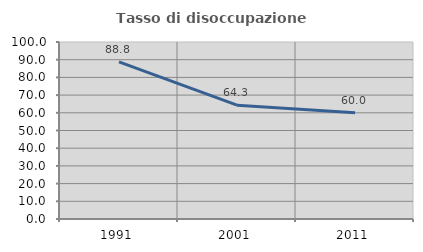
| Category | Tasso di disoccupazione giovanile  |
|---|---|
| 1991.0 | 88.785 |
| 2001.0 | 64.286 |
| 2011.0 | 60 |